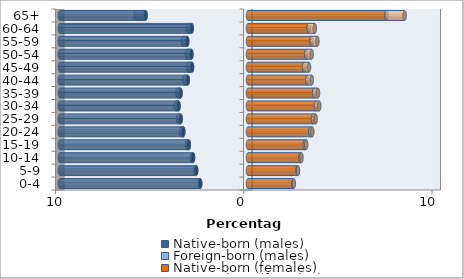
| Category | Native-born (males) | Foreign-born (males) | Native-born (females) | Foreign-born (females) |
|---|---|---|---|---|
| 0-4 | -2.539 | -0.012 | 2.416 | 0.011 |
| 5-9 | -2.752 | -0.039 | 2.634 | 0.022 |
| 10-14 | -2.919 | -0.065 | 2.794 | 0.048 |
| 15-19 | -3.146 | -0.092 | 3.02 | 0.072 |
| 20-24 | -3.434 | -0.12 | 3.314 | 0.105 |
| 25-29 | -3.574 | -0.138 | 3.452 | 0.143 |
| 30-34 | -3.688 | -0.159 | 3.605 | 0.185 |
| 35-39 | -3.583 | -0.166 | 3.512 | 0.209 |
| 40-44 | -3.196 | -0.188 | 3.148 | 0.241 |
| 45-49 | -2.972 | -0.213 | 2.983 | 0.258 |
| 50-54 | -3.005 | -0.241 | 3.095 | 0.289 |
| 55-59 | -3.225 | -0.231 | 3.379 | 0.311 |
| 60-64 | -2.988 | -0.221 | 3.223 | 0.33 |
| 65+ | -5.44 | -0.527 | 7.364 | 0.961 |